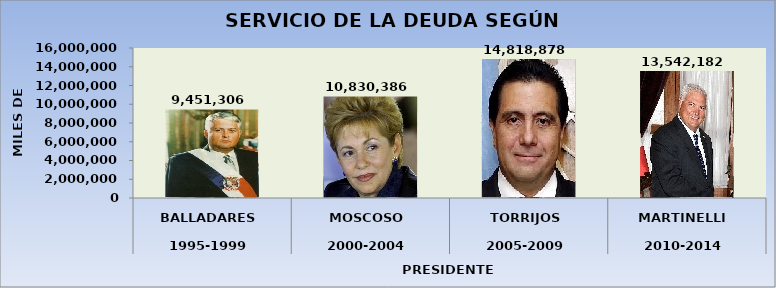
| Category | Series 0 |
|---|---|
| 0 | 9451306 |
| 1 | 10830386 |
| 2 | 14818878 |
| 3 | 13542181.516 |